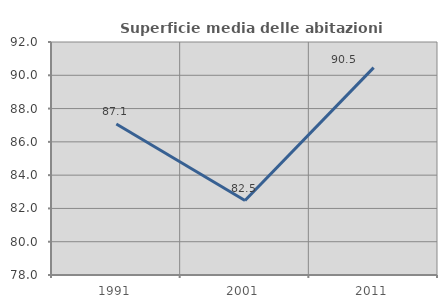
| Category | Superficie media delle abitazioni occupate |
|---|---|
| 1991.0 | 87.071 |
| 2001.0 | 82.474 |
| 2011.0 | 90.462 |